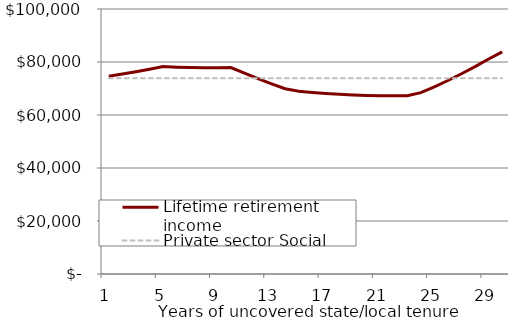
| Category | Lifetime retirement income | Private sector Social Security |
|---|---|---|
| 1.0 | 74654.794 | 73865.287 |
| 2.0 | 75474.302 | 73865.287 |
| 3.0 | 76324.952 | 73865.287 |
| 4.0 | 77269.463 | 73865.287 |
| 5.0 | 78282.206 | 73865.287 |
| 6.0 | 78046.549 | 73865.287 |
| 7.0 | 77886.959 | 73865.287 |
| 8.0 | 77807.649 | 73865.287 |
| 9.0 | 77813.046 | 73865.287 |
| 10.0 | 77907.794 | 73865.287 |
| 11.0 | 75758.127 | 73865.287 |
| 12.0 | 73707.805 | 73865.287 |
| 13.0 | 71762.199 | 73865.287 |
| 14.0 | 69926.944 | 73865.287 |
| 15.0 | 68963.598 | 73865.287 |
| 16.0 | 68533.21 | 73865.287 |
| 17.0 | 68158.477 | 73865.287 |
| 18.0 | 67842.344 | 73865.287 |
| 19.0 | 67587.899 | 73865.287 |
| 20.0 | 67398.381 | 73865.287 |
| 21.0 | 67277.183 | 73865.287 |
| 22.0 | 67227.866 | 73865.287 |
| 23.0 | 67254.161 | 73865.287 |
| 24.0 | 68453.865 | 73865.287 |
| 25.0 | 70632.331 | 73865.287 |
| 26.0 | 73014.531 | 73865.287 |
| 27.0 | 75560.718 | 73865.287 |
| 28.0 | 78279.917 | 73865.287 |
| 29.0 | 81124.123 | 73865.287 |
| 30.0 | 83835.007 | 73865.287 |